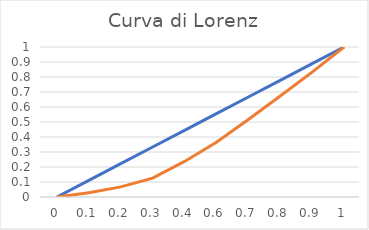
| Category | Fi | Series 1 |
|---|---|---|
| 0.0 | 0 | 0 |
| 0.1111111111111111 | 0.111 | 0.029 |
| 0.2222222222222222 | 0.222 | 0.067 |
| 0.3333333333333333 | 0.333 | 0.126 |
| 0.4444444444444444 | 0.444 | 0.237 |
| 0.5555555555555556 | 0.556 | 0.365 |
| 0.6666666666666666 | 0.667 | 0.517 |
| 0.7777777777777778 | 0.778 | 0.673 |
| 0.8888888888888888 | 0.889 | 0.832 |
| 1.0 | 1 | 1 |